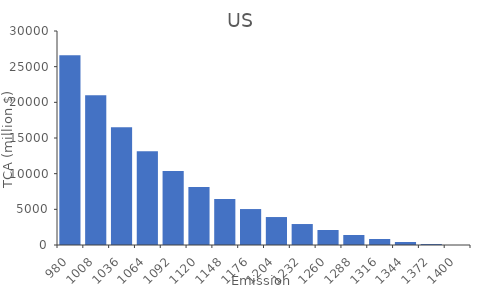
| Category | TCA (million $) |
|---|---|
| 980.0 | 26600 |
| 1008.0 | 21000 |
| 1036.0 | 16520 |
| 1064.0 | 13160 |
| 1092.0 | 10360 |
| 1120.0 | 8120 |
| 1148.0 | 6440 |
| 1176.0 | 5040 |
| 1204.0 | 3920 |
| 1232.0 | 2940 |
| 1260.0 | 2100 |
| 1288.0 | 1400 |
| 1316.0 | 840 |
| 1344.0 | 420 |
| 1372.0 | 140 |
| 1400.0 | 0 |